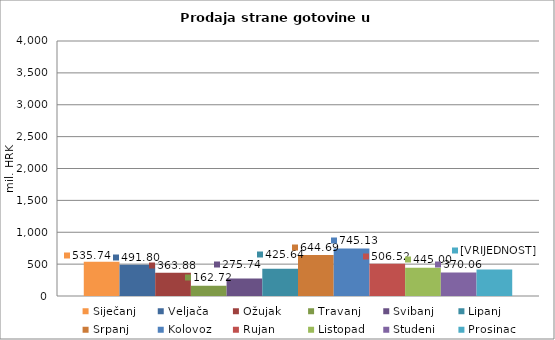
| Category | Siječanj | Veljača | Ožujak | Travanj | Svibanj | Lipanj | Srpanj | Kolovoz | Rujan | Listopad | Studeni | Prosinac |
|---|---|---|---|---|---|---|---|---|---|---|---|---|
| 0 | 535.738 | 491.796 | 363.876 | 162.716 | 275.742 | 425.642 | 644.691 | 745.132 | 506.52 | 445.001 | 370.057 | 416.105 |